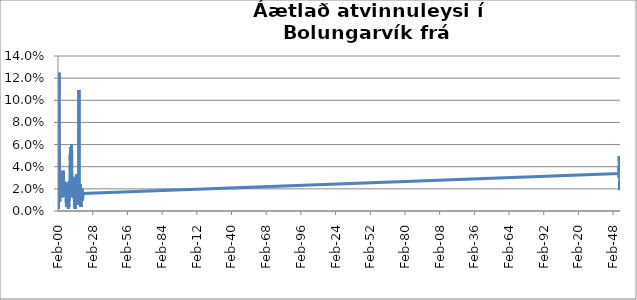
| Category | Series 0 |
|---|---|
| 2000-02-01 | 0.007 |
| 2000-03-01 | 0.009 |
| 2000-04-01 | 0.007 |
| 2000-05-01 | 0.003 |
| 2000-06-01 | 0.003 |
| 2000-07-01 | 0.002 |
| 2000-08-01 | 0.007 |
| 2000-09-01 | 0.012 |
| 2000-10-01 | 0.023 |
| 2000-11-01 | 0.024 |
| 2000-12-01 | 0.125 |
| 2001-01-01 | 0.108 |
| 2001-02-01 | 0.075 |
| 2001-03-01 | 0.054 |
| 2001-04-01 | 0.054 |
| 2001-05-01 | 0.052 |
| 2001-06-01 | 0.021 |
| 2001-07-01 | 0.009 |
| 2001-08-01 | 0.017 |
| 2001-09-01 | 0.017 |
| 2001-10-01 | 0.017 |
| 2001-11-01 | 0.014 |
| 2001-12-01 | 0.014 |
| 2002-01-01 | 0.014 |
| 2002-02-01 | 0.013 |
| 2002-03-01 | 0.014 |
| 2002-04-01 | 0.016 |
| 2002-05-01 | 0.023 |
| 2002-06-01 | 0.016 |
| 2002-07-01 | 0.014 |
| 2002-08-01 | 0.014 |
| 2002-09-01 | 0.018 |
| 2002-10-01 | 0.02 |
| 2002-11-01 | 0.022 |
| 2002-12-01 | 0.031 |
| 2003-01-01 | 0.03 |
| 2003-02-01 | 0.03 |
| 2003-03-01 | 0.025 |
| 2003-04-01 | 0.022 |
| 2003-05-01 | 0.02 |
| 2003-06-01 | 0.02 |
| 2003-07-01 | 0.021 |
| 2003-08-01 | 0.012 |
| 2003-09-01 | 0.028 |
| 2003-10-01 | 0.032 |
| 2003-11-01 | 0.036 |
| 2003-12-01 | 0.028 |
| 2004-01-01 | 0.031 |
| 2004-02-01 | 0.021 |
| 2004-03-01 | 0.036 |
| 2004-04-01 | 0.032 |
| 2004-05-01 | 0.026 |
| 2004-06-01 | 0.034 |
| 2004-07-01 | 0.032 |
| 2004-08-01 | 0.026 |
| 2004-09-01 | 0.021 |
| 2004-10-01 | 0.023 |
| 2004-11-01 | 0.027 |
| 2004-12-01 | 0.017 |
| 2005-01-01 | 0.025 |
| 2005-02-01 | 0.025 |
| 2005-03-01 | 0.019 |
| 2005-04-01 | 0.023 |
| 2005-05-01 | 0.023 |
| 2005-06-01 | 0.015 |
| 2005-07-01 | 0.013 |
| 2005-08-01 | 0.021 |
| 2005-09-01 | 0.022 |
| 2005-10-01 | 0.019 |
| 2005-11-01 | 0.02 |
| 2005-12-01 | 0.018 |
| 2006-01-01 | 0.016 |
| 2006-02-01 | 0.014 |
| 2006-03-01 | 0.018 |
| 2006-04-01 | 0.021 |
| 2006-05-01 | 0.026 |
| 2006-06-01 | 0.019 |
| 2006-07-01 | 0.019 |
| 2006-08-01 | 0.011 |
| 2006-09-01 | 0.007 |
| 2006-10-01 | 0.008 |
| 2006-11-01 | 0.006 |
| 2006-12-01 | 0.006 |
| 2007-01-01 | 0.004 |
| 2007-02-01 | 0.004 |
| 2007-03-01 | 0.012 |
| 2007-04-01 | 0.009 |
| 2007-05-01 | 0.013 |
| 2007-06-01 | 0.008 |
| 2007-07-01 | 0.006 |
| 2007-08-01 | 0.025 |
| 2007-09-01 | 0.017 |
| 2007-10-01 | 0.024 |
| 2007-11-01 | 0.02 |
| 2007-12-01 | 0.014 |
| 2008-01-01 | 0.004 |
| 2008-02-01 | 0.004 |
| 2008-03-01 | 0.012 |
| 2008-04-01 | 0.009 |
| 2008-05-01 | 0.004 |
| 2008-06-01 | 0.004 |
| 2008-07-01 | 0.002 |
| 2008-08-01 | 0.004 |
| 2008-09-01 | 0.006 |
| 2008-10-01 | 0.004 |
| 2008-11-01 | 0.006 |
| 2008-12-01 | 0.009 |
| 2009-01-01 | 0.012 |
| 2009-02-01 | 0.01 |
| 2009-03-01 | 0.019 |
| 2009-04-01 | 0.027 |
| 2009-05-01 | 0.023 |
| 2009-06-01 | 0.018 |
| 2009-07-01 | 0.018 |
| 2009-08-01 | 0.016 |
| 2009-09-01 | 0.023 |
| 2009-10-01 | 0.029 |
| 2009-11-01 | 0.038 |
| 2009-12-01 | 0.047 |
| 2010-01-01 | 0.051 |
| 2010-02-01 | 0.044 |
| 2010-03-01 | 0.046 |
| 2010-04-01 | 0.056 |
| 2010-05-01 | 0.058 |
| 2010-06-01 | 0.044 |
| 2010-07-01 | 0.041 |
| 2010-08-01 | 0.037 |
| 2010-09-01 | 0.035 |
| 2010-10-01 | 0.029 |
| 2010-11-01 | 0.032 |
| 2010-12-01 | 0.06 |
| 2011-01-01 | 0.059 |
| 2011-02-01 | 0.055 |
| 2011-03-01 | 0.053 |
| 2011-04-01 | 0.043 |
| 2011-05-01 | 0.022 |
| 2011-06-01 | 0.02 |
| 2011-07-01 | 0.018 |
| 2011-08-01 | 0.022 |
| 2011-09-01 | 0.014 |
| 2011-10-01 | 0.013 |
| 2011-11-01 | 0.017 |
| 2011-12-01 | 0.027 |
| 2012-01-01 | 0.027 |
| 2012-02-01 | 0.027 |
| 2012-03-01 | 0.031 |
| 2012-04-01 | 0.028 |
| 2012-05-01 | 0.016 |
| 2012-06-01 | 0.012 |
| 2012-07-01 | 0.012 |
| 2012-08-01 | 0.012 |
| 2012-09-01 | 0.019 |
| 2012-10-01 | 0.03 |
| 2012-11-01 | 0.028 |
| 2012-12-01 | 0.026 |
| 2013-01-01 | 0.024 |
| 2013-02-01 | 0.02 |
| 2013-03-01 | 0.018 |
| 2013-04-01 | 0.011 |
| 2013-05-01 | 0.009 |
| 2013-06-01 | 0.006 |
| 2013-07-01 | 0.007 |
| 2013-08-01 | 0.007 |
| 2013-09-01 | 0.004 |
| 2013-10-01 | 0.004 |
| 2013-11-01 | 0.004 |
| 2013-12-01 | 0.002 |
| 2014-01-01 | 0.006 |
| 2014-02-01 | 0.01 |
| 2014-03-01 | 0.014 |
| 2014-04-01 | 0.014 |
| 2014-05-01 | 0.018 |
| 2014-06-01 | 0.016 |
| 2014-07-01 | 0.012 |
| 2014-08-01 | 0.006 |
| 2014-09-01 | 0.012 |
| 2014-10-01 | 0.016 |
| 2014-11-01 | 0.02 |
| 2014-12-01 | 0.021 |
| 2015-01-01 | 0.025 |
| 2015-02-01 | 0.033 |
| 2015-03-01 | 0.033 |
| 2015-04-01 | 0.032 |
| 2015-05-01 | 0.026 |
| 2015-06-01 | 0.023 |
| 2015-07-01 | 0.019 |
| 2015-08-01 | 0.017 |
| 2015-09-01 | 0.011 |
| 2015-10-01 | 0.012 |
| 2015-11-01 | 0.01 |
| 2015-12-01 | 0.012 |
| 2016-01-01 | 0.012 |
| 2016-02-01 | 0.017 |
| 2016-03-01 | 0.019 |
| 2016-04-01 | 0.023 |
| 2016-05-01 | 0.027 |
| 2016-06-01 | 0.013 |
| 2016-07-01 | 0.011 |
| 2016-08-01 | 0.007 |
| 2016-09-01 | 0.009 |
| 2016-10-01 | 0.006 |
| 2016-11-01 | 0.023 |
| 2016-12-01 | 0.096 |
| 2017-01-01 | 0.109 |
| 2017-02-01 | 0.023 |
| 2017-03-01 | 0.017 |
| 2017-04-01 | 0.015 |
| 2017-05-01 | 0.009 |
| 2017-06-01 | 0.009 |
| 2017-07-01 | 0.007 |
| 2017-08-01 | 0.02 |
| 2017-09-01 | 0.016 |
| 2017-10-01 | 0.017 |
| 2017-11-01 | 0.017 |
| 2017-12-01 | 0.015 |
| 2018-01-01 | 0.019 |
| 2018-02-01 | 0.024 |
| 2018-03-01 | 0.024 |
| 2018-04-01 | 0.018 |
| 2018-05-01 | 0.011 |
| 2018-06-01 | 0.007 |
| 2018-07-01 | 0.004 |
| 2018-08-01 | 0.006 |
| 2018-09-01 | 0.004 |
| 2018-10-01 | 0.013 |
| 2018-11-01 | 0.013 |
| 2018-12-01 | 0.013 |
| 2019-01-01 | 0.013 |
| 2019-02-01 | 0.019 |
| 2019-03-01 | 0.017 |
| 2019-04-01 | 0.02 |
| 2019-05-01 | 0.015 |
| 2019-06-01 | 0.013 |
| 2019-07-01 | 0.013 |
| 2019-08-01 | 0.009 |
| 2019-09-01 | 0.013 |
| 2019-10-01 | 0.013 |
| 2019-11-01 | 0.019 |
| 2019-12-01 | 0.013 |
| 2020-01-01 | 0.012 |
| 2020-02-01 | 0.016 |
| 202003.0 | 0.034 |
| 202004.0 | 0.04 |
| 202005.0 | 0.03 |
| 202006.0 | 0.04 |
| 202007.0 | 0.036 |
| 202008.0 | 0.038 |
| 202009.0 | 0.04 |
| 202010.0 | 0.044 |
| 202011.0 | 0.05 |
| 202012.0 | 0.046 |
| 202101.0 | 0.043 |
| 202102.0 | 0.039 |
| 202103.0 | 0.039 |
| 202104.0 | 0.038 |
| 202105.0 | 0.028 |
| 202106.0 | 0.028 |
| 202107.0 | 0.025 |
| 202108.0 | 0.027 |
| 202109.0 | 0.019 |
| 202110.0 | 0.025 |
| 202111.0 | 0.021 |
| 202112.0 | 0.023 |
| 202201.0 | 0.027 |
| 202202.0 | 0.025 |
| 202203.0 | 0.023 |
| 202204.0 | 0.019 |